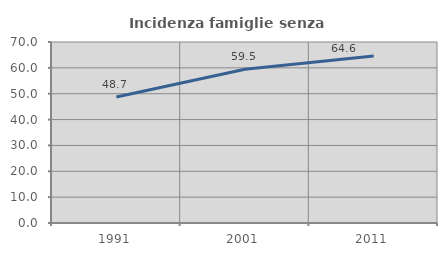
| Category | Incidenza famiglie senza nuclei |
|---|---|
| 1991.0 | 48.739 |
| 2001.0 | 59.459 |
| 2011.0 | 64.615 |